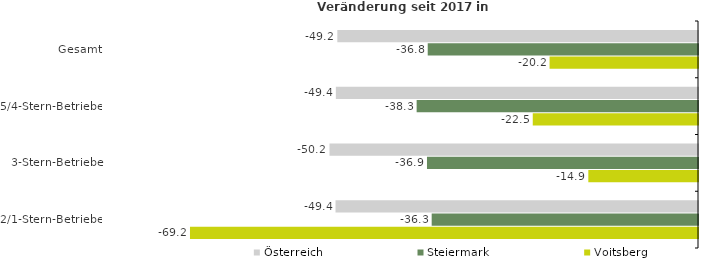
| Category | Österreich | Steiermark | Voitsberg |
|---|---|---|---|
| Gesamt | -49.154 | -36.835 | -20.227 |
| 5/4-Stern-Betriebe | -49.355 | -38.346 | -22.52 |
| 3-Stern-Betriebe | -50.222 | -36.936 | -14.948 |
| 2/1-Stern-Betriebe | -49.399 | -36.296 | -69.236 |